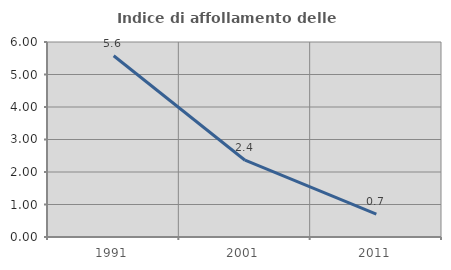
| Category | Indice di affollamento delle abitazioni  |
|---|---|
| 1991.0 | 5.576 |
| 2001.0 | 2.362 |
| 2011.0 | 0.702 |